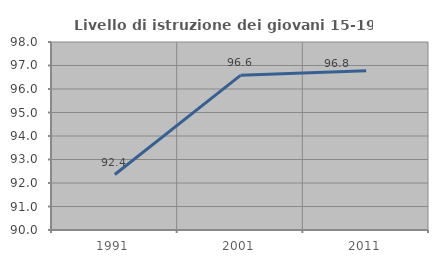
| Category | Livello di istruzione dei giovani 15-19 anni |
|---|---|
| 1991.0 | 92.361 |
| 2001.0 | 96.581 |
| 2011.0 | 96.774 |